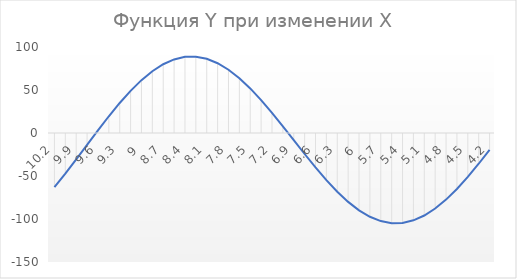
| Category | Series 0 |
|---|---|
| 10.2 | -62.815 |
| 10.049999999999999 | -47.158 |
| 9.899999999999999 | -30.661 |
| 9.749999999999998 | -13.76 |
| 9.599999999999998 | 3.1 |
| 9.449999999999998 | 19.472 |
| 9.299999999999997 | 34.925 |
| 9.149999999999997 | 49.049 |
| 8.999999999999996 | 61.474 |
| 8.849999999999996 | 71.873 |
| 8.699999999999996 | 79.976 |
| 8.549999999999995 | 85.572 |
| 8.399999999999995 | 88.521 |
| 8.249999999999995 | 88.754 |
| 8.099999999999994 | 86.274 |
| 7.949999999999994 | 81.159 |
| 7.799999999999994 | 73.558 |
| 7.649999999999993 | 63.688 |
| 7.499999999999993 | 51.825 |
| 7.3499999999999925 | 38.302 |
| 7.199999999999992 | 23.495 |
| 7.049999999999992 | 7.816 |
| 6.8999999999999915 | -8.302 |
| 6.749999999999991 | -24.41 |
| 6.599999999999991 | -40.064 |
| 6.44999999999999 | -54.829 |
| 6.29999999999999 | -68.297 |
| 6.14999999999999 | -80.093 |
| 5.999999999999989 | -89.89 |
| 5.849999999999989 | -97.413 |
| 5.699999999999989 | -102.45 |
| 5.549999999999988 | -104.858 |
| 5.399999999999988 | -104.563 |
| 5.249999999999988 | -101.566 |
| 5.099999999999987 | -95.943 |
| 4.949999999999987 | -87.837 |
| 4.7999999999999865 | -77.464 |
| 4.649999999999986 | -65.097 |
| 4.499999999999986 | -51.066 |
| 4.349999999999985 | -35.745 |
| 4.199999999999985 | -19.544 |